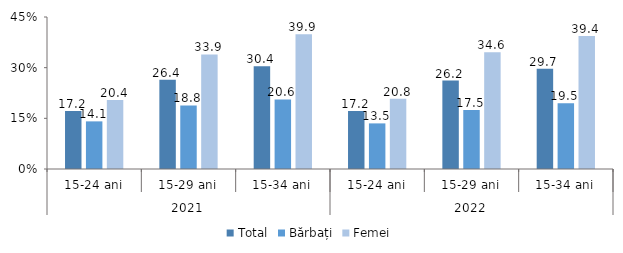
| Category | Total | Bărbați | Femei |
|---|---|---|---|
| 0 | 17.2 | 14.1 | 20.4 |
| 1 | 26.4 | 18.8 | 33.9 |
| 2 | 30.4 | 20.6 | 39.9 |
| 3 | 17.2 | 13.5 | 20.8 |
| 4 | 26.2 | 17.5 | 34.6 |
| 5 | 29.7 | 19.5 | 39.4 |